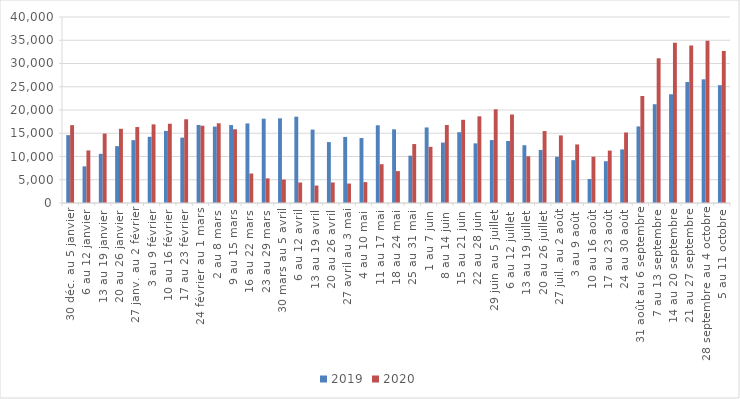
| Category | 2019 | 2020 |
|---|---|---|
| 30 déc. au 5 janvier | 14597 | 16739 |
| 6 au 12 janvier | 7879 | 11307 |
| 13 au 19 janvier | 10570 | 14936 |
| 20 au 26 janvier | 12222 | 15957 |
| 27 janv. au 2 février | 13510 | 16332 |
| 3 au 9 février | 14232 | 16910 |
| 10 au 16 février | 15499 | 17045 |
| 17 au 23 février | 14063 | 18011 |
| 24 février au 1 mars | 16783 | 16618 |
| 2 au 8 mars | 16432 | 17141 |
| 9 au 15 mars | 16765 | 15857 |
| 16 au 22 mars | 17107 | 6337 |
| 23 au 29 mars | 18126 | 5296 |
| 30 mars au 5 avril | 18204 | 5048 |
| 6 au 12 avril | 18560 | 4404 |
| 13 au 19 avril | 15788 | 3750 |
| 20 au 26 avril | 13099 | 4419 |
| 27 avril au 3 mai | 14207 | 4185 |
| 4 au 10 mai | 13969 | 4490 |
| 11 au 17 mai | 16713 | 8346 |
| 18 au 24 mai | 15841 | 6857 |
| 25 au 31 mai | 10184 | 12676 |
| 1 au 7 juin | 16246 | 12077 |
| 8 au 14 juin | 12988 | 16778 |
| 15 au 21 juin | 15214 | 17894 |
| 22 au 28 juin | 12823 | 18644 |
| 29 juin au 5 juillet | 13531 | 20155 |
| 6 au 12 juillet | 13339 | 19029 |
| 13 au 19 juillet | 12424 | 10055 |
| 20 au 26 juillet | 11414 | 15472 |
| 27 juil. au 2 août | 9944 | 14534 |
| 3 au 9 août | 9210 | 12595 |
| 10 au 16 août | 5155 | 9961 |
| 17 au 23 août | 8985 | 11277 |
| 24 au 30 août | 11520 | 15162 |
| 31 août au 6 septembre | 16465 | 23007 |
| 7 au 13 septembre | 21242 | 31112 |
| 14 au 20 septembre | 23386 | 34479 |
| 21 au 27 septembre | 26016 | 33897 |
| 28 septembre au 4 octobre | 26599 | 34873 |
| 5 au 11 octobre | 25337 | 32681 |